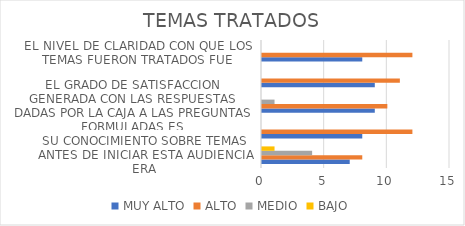
| Category | MUY ALTO | ALTO | MEDIO | BAJO |
|---|---|---|---|---|
| SU CONOCIMIENTO SOBRE TEMAS ANTES DE INICIAR ESTA AUDIENCIA ERA | 7 | 8 | 4 | 1 |
| SU CONOCIMIENTO SOBRE TEMAS DESPUES DE FINALIZAR LA AUDIENCIA ES | 8 | 12 | 0 | 0 |
| EL GRADO DE SATISFACCION GENERADA CON LAS RESPUESTAS DADAS POR LA CAJA A LAS PREGUNTAS FORMULADAS ES | 9 | 10 | 1 | 0 |
| EL NIVEL DE CALIFICACION QUE USTED OTORGA A LA CALIDAD DEL CONTENIDO EN LOS TEMAS TRATADOS ES | 9 | 11 | 0 | 0 |
| EL NIVEL DE CLARIDAD CON QUE LOS TEMAS FUERON TRATADOS FUE | 8 | 12 | 0 | 0 |